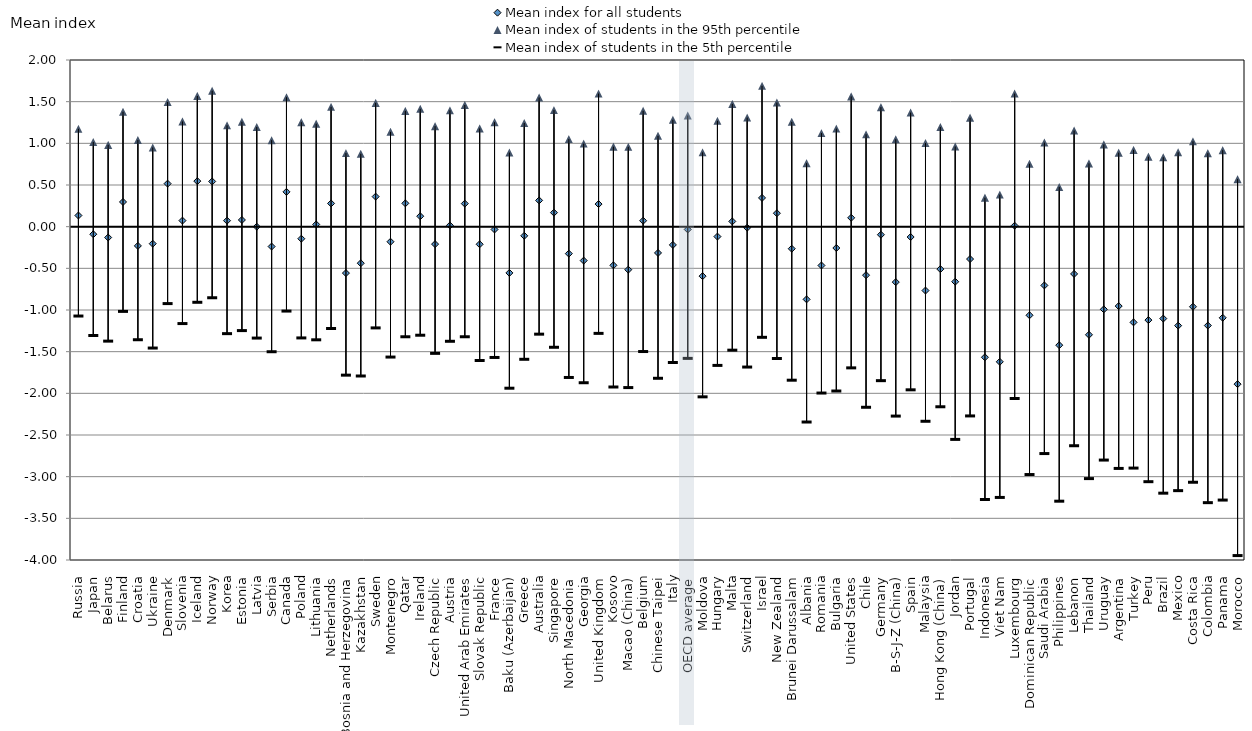
| Category | Mean index for all students | Mean index of students in the 95th percentile | Mean index of students in the 5th percentile |
|---|---|---|---|
| Russia | 0.134 | 1.175 | -1.066 |
| Japan | -0.091 | 1.016 | -1.3 |
| Belarus | -0.13 | 0.981 | -1.368 |
| Finland | 0.296 | 1.379 | -1.011 |
| Croatia | -0.231 | 1.04 | -1.351 |
| Ukraine | -0.204 | 0.95 | -1.45 |
| Denmark | 0.516 | 1.496 | -0.917 |
| Slovenia | 0.073 | 1.263 | -1.157 |
| Iceland | 0.547 | 1.568 | -0.902 |
| Norway | 0.542 | 1.631 | -0.847 |
| Korea | 0.072 | 1.216 | -1.278 |
| Estonia | 0.08 | 1.259 | -1.241 |
| Latvia | 0 | 1.197 | -1.331 |
| Serbia | -0.239 | 1.038 | -1.495 |
| Canada | 0.418 | 1.554 | -1.007 |
| Poland | -0.145 | 1.254 | -1.329 |
| Lithuania | 0.027 | 1.236 | -1.352 |
| Netherlands | 0.279 | 1.438 | -1.216 |
| Bosnia and Herzegovina | -0.557 | 0.883 | -1.776 |
| Kazakhstan | -0.439 | 0.875 | -1.786 |
| Sweden | 0.361 | 1.485 | -1.209 |
| Montenegro | -0.181 | 1.138 | -1.559 |
| Qatar | 0.28 | 1.39 | -1.315 |
| Ireland | 0.126 | 1.414 | -1.297 |
| Czech Republic | -0.209 | 1.206 | -1.514 |
| Austria | 0.014 | 1.396 | -1.369 |
| United Arab Emirates | 0.277 | 1.461 | -1.315 |
| Slovak Republic | -0.211 | 1.179 | -1.6 |
| France | -0.034 | 1.254 | -1.564 |
| Baku (Azerbaijan) | -0.555 | 0.889 | -1.932 |
| Greece | -0.11 | 1.244 | -1.586 |
| Australia | 0.315 | 1.55 | -1.284 |
| Singapore | 0.168 | 1.399 | -1.441 |
| North Macedonia | -0.324 | 1.051 | -1.804 |
| Georgia | -0.407 | 0.997 | -1.867 |
| United Kingdom | 0.271 | 1.598 | -1.274 |
| Kosovo | -0.464 | 0.96 | -1.918 |
| Macao (China) | -0.516 | 0.958 | -1.925 |
| Belgium | 0.071 | 1.39 | -1.492 |
| Chinese Taipei | -0.315 | 1.09 | -1.813 |
| Italy | -0.219 | 1.283 | -1.624 |
| OECD average | -0.033 | 1.333 | -1.575 |
| Moldova | -0.594 | 0.892 | -2.036 |
| Hungary | -0.119 | 1.27 | -1.659 |
| Malta | 0.063 | 1.473 | -1.476 |
| Switzerland | -0.013 | 1.309 | -1.679 |
| Israel | 0.345 | 1.69 | -1.322 |
| New Zealand | 0.161 | 1.489 | -1.576 |
| Brunei Darussalam | -0.265 | 1.258 | -1.836 |
| Albania | -0.872 | 0.762 | -2.338 |
| Romania | -0.466 | 1.123 | -1.99 |
| Bulgaria | -0.256 | 1.177 | -1.966 |
| United States | 0.106 | 1.563 | -1.688 |
| Chile | -0.582 | 1.109 | -2.161 |
| Germany | -0.097 | 1.434 | -1.842 |
| B-S-J-Z (China) | -0.665 | 1.05 | -2.267 |
| Spain | -0.124 | 1.37 | -1.952 |
| Malaysia | -0.767 | 1.003 | -2.329 |
| Hong Kong (China) | -0.509 | 1.196 | -2.155 |
| Jordan | -0.661 | 0.962 | -2.547 |
| Portugal | -0.388 | 1.307 | -2.265 |
| Indonesia | -1.567 | 0.347 | -3.268 |
| Viet Nam | -1.622 | 0.385 | -3.243 |
| Luxembourg | 0.011 | 1.598 | -2.056 |
| Dominican Republic | -1.063 | 0.755 | -2.968 |
| Saudi Arabia | -0.705 | 1.009 | -2.717 |
| Philippines | -1.422 | 0.477 | -3.288 |
| Lebanon | -0.567 | 1.153 | -2.623 |
| Thailand | -1.297 | 0.759 | -3.017 |
| Uruguay | -0.992 | 0.986 | -2.795 |
| Argentina | -0.953 | 0.888 | -2.895 |
| Turkey | -1.148 | 0.922 | -2.891 |
| Peru | -1.121 | 0.84 | -3.054 |
| Brazil | -1.103 | 0.834 | -3.192 |
| Mexico | -1.188 | 0.892 | -3.162 |
| Costa Rica | -0.961 | 1.024 | -3.061 |
| Colombia | -1.186 | 0.882 | -3.306 |
| Panama | -1.094 | 0.918 | -3.275 |
| Morocco | -1.89 | 0.57 | -3.941 |